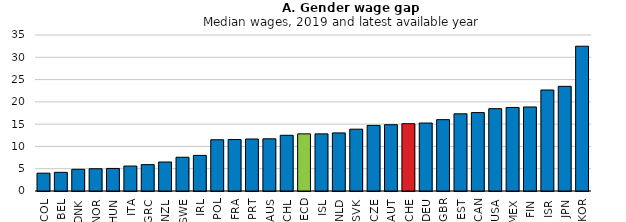
| Category | 2019 or latest available year |
|---|---|
| COL | 4 |
| BEL | 4.19 |
| DNK | 4.863 |
| NOR | 4.994 |
| HUN | 5.063 |
| ITA | 5.597 |
| GRC | 5.914 |
| NZL | 6.508 |
| SWE | 7.576 |
| IRL | 7.99 |
| POL | 11.498 |
| FRA | 11.546 |
| PRT | 11.665 |
| AUS | 11.714 |
| CHL | 12.5 |
| OECD | 12.819 |
| ISL | 12.82 |
| NLD | 13.029 |
| SVK | 13.87 |
| CZE | 14.714 |
| AUT | 14.877 |
| CHE | 15.096 |
| DEU | 15.25 |
| GBR | 16.009 |
| EST | 17.318 |
| CAN | 17.594 |
| USA | 18.471 |
| MEX | 18.75 |
| FIN | 18.855 |
| ISR | 22.659 |
| JPN | 23.48 |
| KOR | 32.48 |